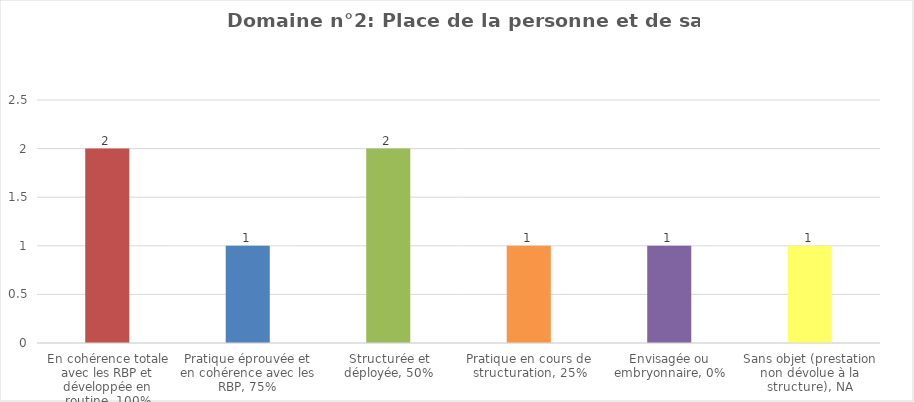
| Category | Domaine n°2: Place de la personne et de sa famille |
|---|---|
| En cohérence totale avec les RBP et développée en routine, 100% | 2 |
| Pratique éprouvée et en cohérence avec les RBP, 75% | 1 |
| Structurée et déployée, 50% | 2 |
| Pratique en cours de structuration, 25% | 1 |
| Envisagée ou embryonnaire, 0% | 1 |
| Sans objet (prestation non dévolue à la structure), NA | 1 |